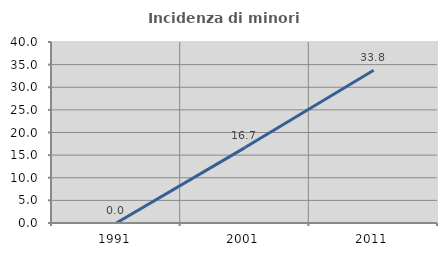
| Category | Incidenza di minori stranieri |
|---|---|
| 1991.0 | 0 |
| 2001.0 | 16.667 |
| 2011.0 | 33.75 |